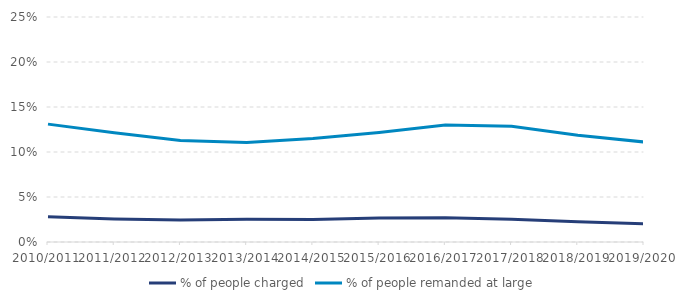
| Category | % of people charged | % of people remanded at large |
|---|---|---|
| 2010/2011 | 0.028 | 0.131 |
| 2011/2012 | 0.026 | 0.121 |
| 2012/2013 | 0.024 | 0.113 |
| 2013/2014 | 0.025 | 0.111 |
| 2014/2015 | 0.025 | 0.115 |
| 2015/2016 | 0.027 | 0.122 |
| 2016/2017 | 0.027 | 0.13 |
| 2017/2018 | 0.025 | 0.129 |
| 2018/2019 | 0.022 | 0.119 |
| 2019/2020 | 0.02 | 0.111 |